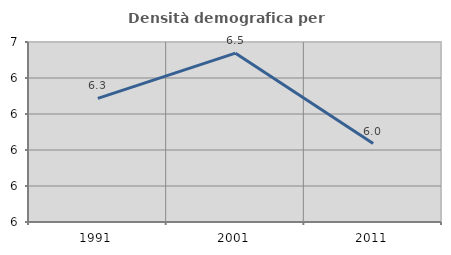
| Category | Densità demografica |
|---|---|
| 1991.0 | 6.287 |
| 2001.0 | 6.538 |
| 2011.0 | 6.036 |